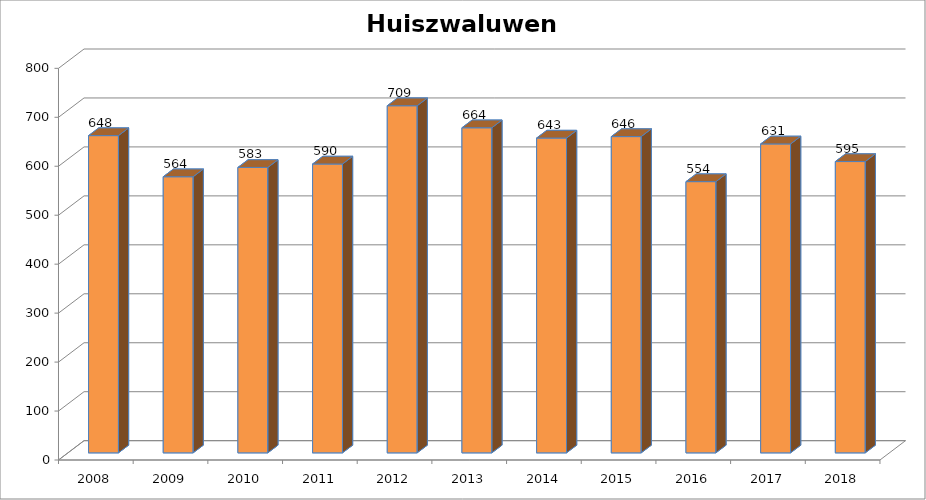
| Category | Totaal  |
|---|---|
| 2008.0 | 648 |
| 2009.0 | 564 |
| 2010.0 | 583 |
| 2011.0 | 590 |
| 2012.0 | 709 |
| 2013.0 | 664 |
| 2014.0 | 643 |
| 2015.0 | 646 |
| 2016.0 | 554 |
| 2017.0 | 631 |
| 2018.0 | 595 |